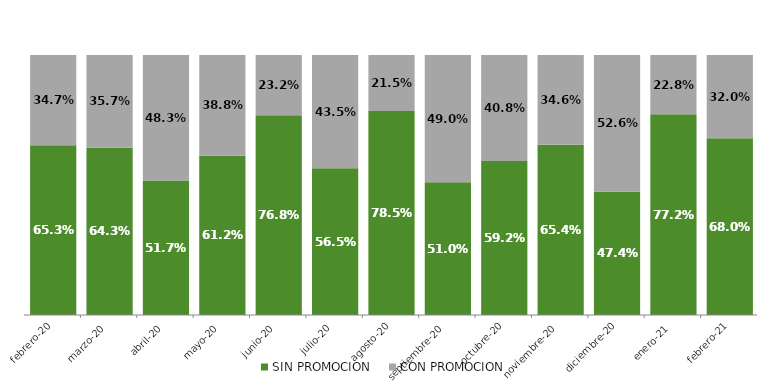
| Category | SIN PROMOCION   | CON PROMOCION   |
|---|---|---|
| 2020-02-01 | 0.653 | 0.347 |
| 2020-03-01 | 0.643 | 0.357 |
| 2020-04-01 | 0.517 | 0.483 |
| 2020-05-01 | 0.612 | 0.388 |
| 2020-06-01 | 0.768 | 0.232 |
| 2020-07-01 | 0.565 | 0.435 |
| 2020-08-01 | 0.785 | 0.215 |
| 2020-09-01 | 0.51 | 0.49 |
| 2020-10-01 | 0.592 | 0.408 |
| 2020-11-01 | 0.654 | 0.346 |
| 2020-12-01 | 0.474 | 0.526 |
| 2021-01-01 | 0.772 | 0.228 |
| 2021-02-01 | 0.68 | 0.32 |